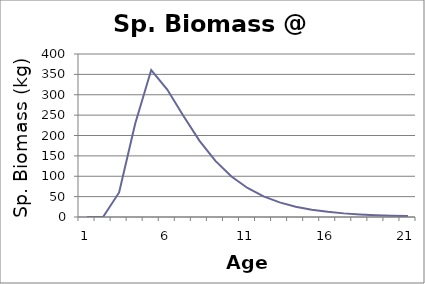
| Category | Sp. Biomass |
|---|---|
| 0 | 0 |
| 1 | 0 |
| 2 | 60.302 |
| 3 | 228.672 |
| 4 | 360.692 |
| 5 | 312.827 |
| 6 | 248.335 |
| 7 | 187.627 |
| 8 | 137.779 |
| 9 | 99.501 |
| 10 | 71.151 |
| 11 | 50.581 |
| 12 | 35.831 |
| 13 | 25.33 |
| 14 | 17.883 |
| 15 | 12.616 |
| 16 | 8.897 |
| 17 | 6.272 |
| 18 | 4.421 |
| 19 | 3.116 |
| 20 | 2.196 |